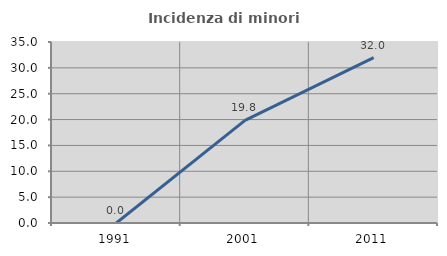
| Category | Incidenza di minori stranieri |
|---|---|
| 1991.0 | 0 |
| 2001.0 | 19.847 |
| 2011.0 | 31.964 |